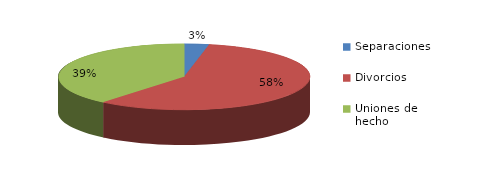
| Category | Series 0 |
|---|---|
| Separaciones | 32 |
| Divorcios | 585 |
| Uniones de hecho | 394 |